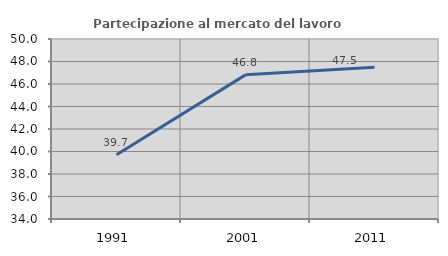
| Category | Partecipazione al mercato del lavoro  femminile |
|---|---|
| 1991.0 | 39.703 |
| 2001.0 | 46.812 |
| 2011.0 | 47.483 |